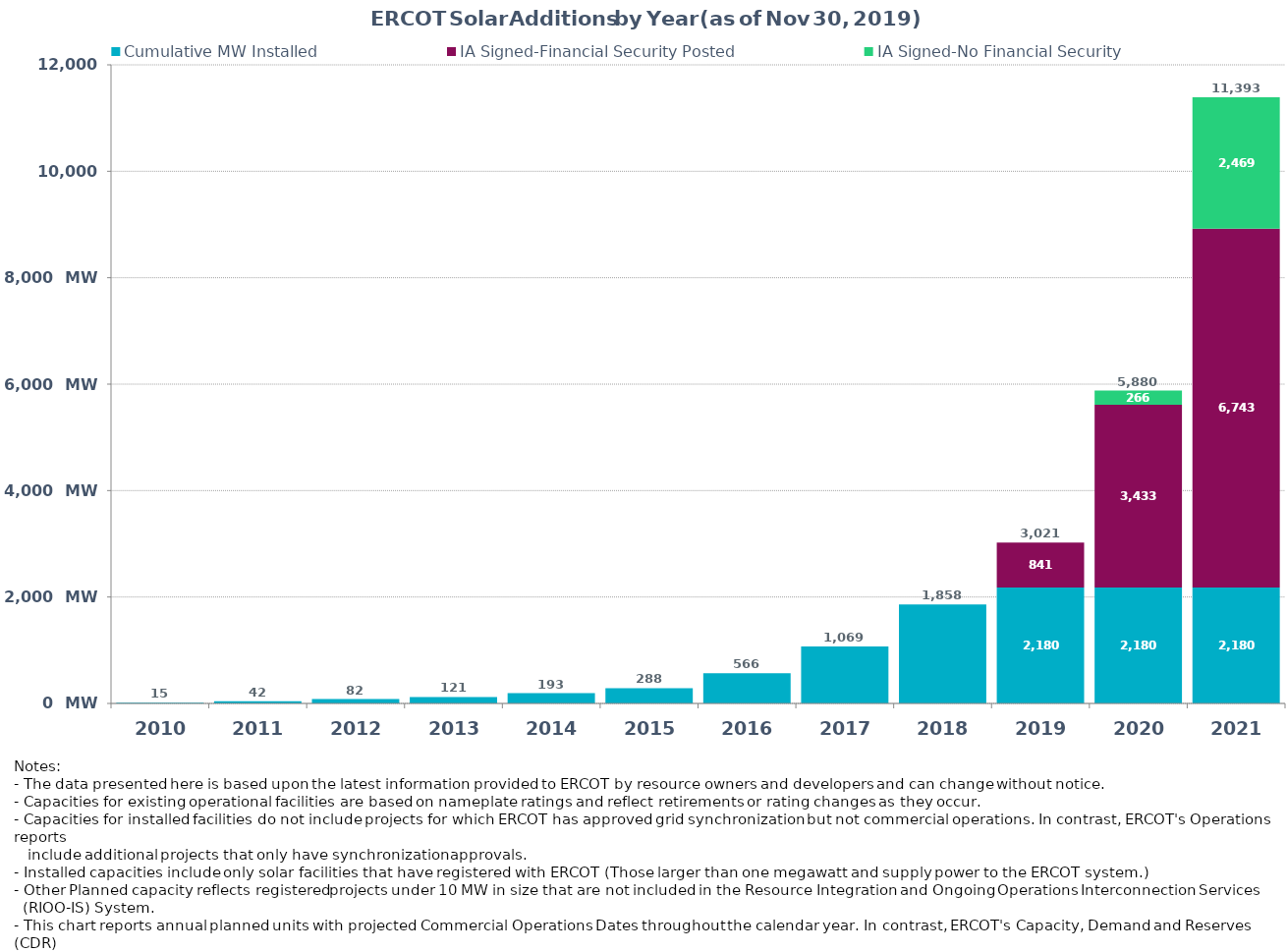
| Category | Cumulative MW Installed | IA Signed-Financial Security Posted  | IA Signed-No Financial Security  | Other Planned | Cumulative Installed and Planned |
|---|---|---|---|---|---|
| 2010.0 | 15 | 0 | 0 | 0 | 15 |
| 2011.0 | 42 | 0 | 0 | 0 | 42 |
| 2012.0 | 82 | 0 | 0 | 0 | 82 |
| 2013.0 | 121 | 0 | 0 | 0 | 121 |
| 2014.0 | 193 | 0 | 0 | 0 | 193 |
| 2015.0 | 287.7 | 0 | 0 | 0 | 287.7 |
| 2016.0 | 566.4 | 0 | 0 | 0 | 566.4 |
| 2017.0 | 1068.7 | 0 | 0 | 0 | 1068.7 |
| 2018.0 | 1857.7 | 0 | 0 | 0 | 1857.7 |
| 2019.0 | 2180.41 | 840.8 | 0 | 0 | 3021.21 |
| 2020.0 | 2180.41 | 3433.41 | 266 | 0 | 5879.82 |
| 2021.0 | 2180.41 | 6743.3 | 2469.28 | 0 | 11392.99 |